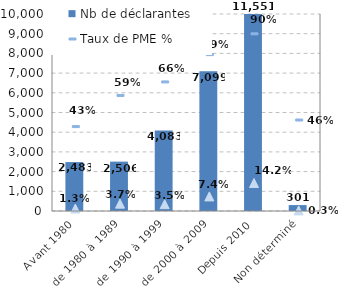
| Category | Nb de déclarantes |
|---|---|
| Avant 1980 | 2483 |
| de 1980 à 1989 | 2506 |
| de 1990 à 1999 | 4083 |
| de 2000 à 2009 | 7099 |
| Depuis 2010 | 11551 |
| Non déterminé | 301 |